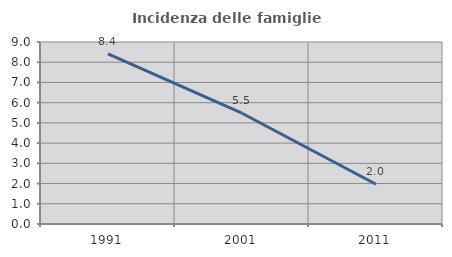
| Category | Incidenza delle famiglie numerose |
|---|---|
| 1991.0 | 8.418 |
| 2001.0 | 5.477 |
| 2011.0 | 1.966 |